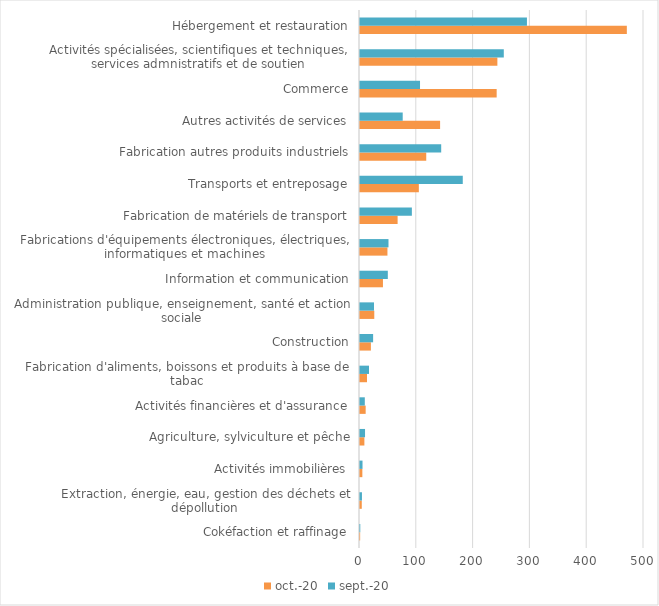
| Category | oct.-20 | sept.-20 |
|---|---|---|
| Cokéfaction et raffinage | 0.265 | 0.5 |
| Extraction, énergie, eau, gestion des déchets et dépollution | 3.121 | 3.437 |
| Activités immobilières | 4.14 | 4.422 |
| Agriculture, sylviculture et pêche | 7.71 | 8.86 |
| Activités financières et d'assurance | 9.981 | 8.471 |
| Fabrication d'aliments, boissons et produits à base de tabac | 12.309 | 15.878 |
| Construction | 19.19 | 23.094 |
| Administration publique, enseignement, santé et action sociale | 25.157 | 24.604 |
| Information et communication | 40.416 | 48.978 |
| Fabrications d'équipements électroniques, électriques, informatiques et machines | 48.316 | 50.154 |
| Fabrication de matériels de transport | 66.22 | 91.311 |
| Transports et entreposage | 103.586 | 180.928 |
| Fabrication autres produits industriels | 116.632 | 142.956 |
| Autres activités de services | 141.022 | 75.199 |
| Commerce | 240.618 | 105.67 |
| Activités spécialisées, scientifiques et techniques, services admnistratifs et de soutien | 241.862 | 253.166 |
| Hébergement et restauration | 469.793 | 293.906 |